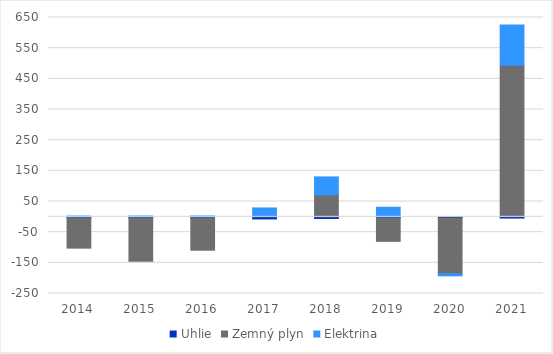
| Category | Uhlie | Zemný plyn | Elektrina |
|---|---|---|---|
| 2014.0 | -3.523 | -98.556 | 2.608 |
| 2015.0 | -3.963 | -140.855 | 2.742 |
| 2016.0 | -3.811 | -105.037 | 2.842 |
| 2017.0 | -6.953 | 4.048 | 24.909 |
| 2018.0 | -5.473 | 71.693 | 58.497 |
| 2019.0 | -4.221 | -75.721 | 31.327 |
| 2020.0 | -3.764 | -182.155 | -6.533 |
| 2021.0 | -4.06 | 494.511 | 131.249 |